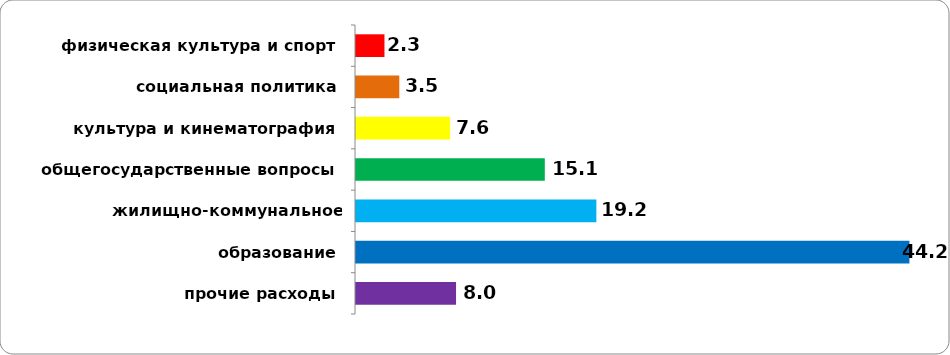
| Category | Series 0 |
|---|---|
| прочие расходы | 8.048 |
| образование | 44.158 |
| жилищно-коммунальное хозяйство | 19.224 |
| общегосударственные вопросы | 15.117 |
| культура и кинематография | 7.578 |
| социальная политика | 3.528 |
| физическая культура и спорт | 2.347 |